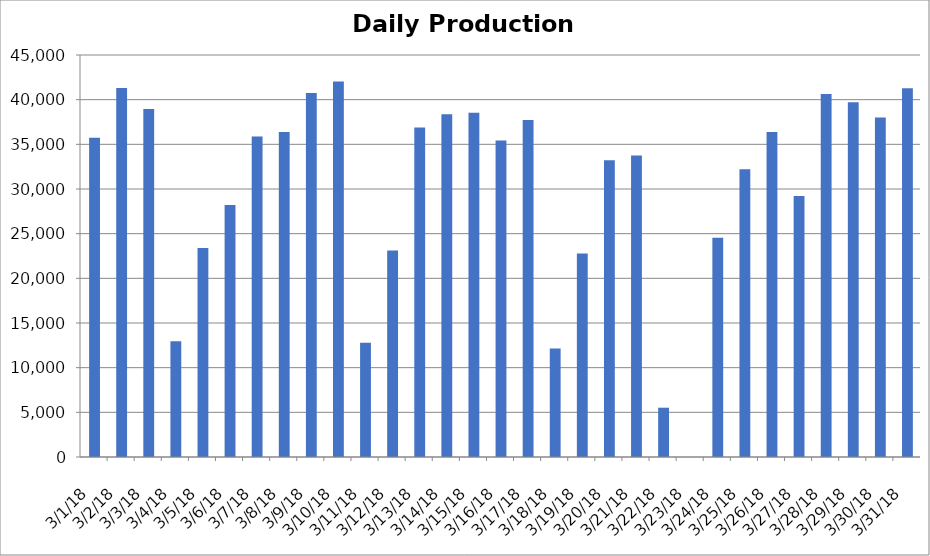
| Category | Series 0 |
|---|---|
| 3/1/18 | 35739 |
| 3/2/18 | 41302 |
| 3/3/18 | 38962 |
| 3/4/18 | 12955 |
| 3/5/18 | 23401 |
| 3/6/18 | 28208 |
| 3/7/18 | 35878 |
| 3/8/18 | 36369 |
| 3/9/18 | 40749 |
| 3/10/18 | 42041 |
| 3/11/18 | 12798 |
| 3/12/18 | 23127 |
| 3/13/18 | 36894 |
| 3/14/18 | 38358 |
| 3/15/18 | 38542 |
| 3/16/18 | 35425 |
| 3/17/18 | 37711 |
| 3/18/18 | 12139 |
| 3/19/18 | 22770 |
| 3/20/18 | 33205 |
| 3/21/18 | 33744 |
| 3/22/18 | 5518 |
| 3/23/18 | 0 |
| 3/24/18 | 24553 |
| 3/25/18 | 32219 |
| 3/26/18 | 36385 |
| 3/27/18 | 29223 |
| 3/28/18 | 40644 |
| 3/29/18 | 39721 |
| 3/30/18 | 38013 |
| 3/31/18 | 41275 |